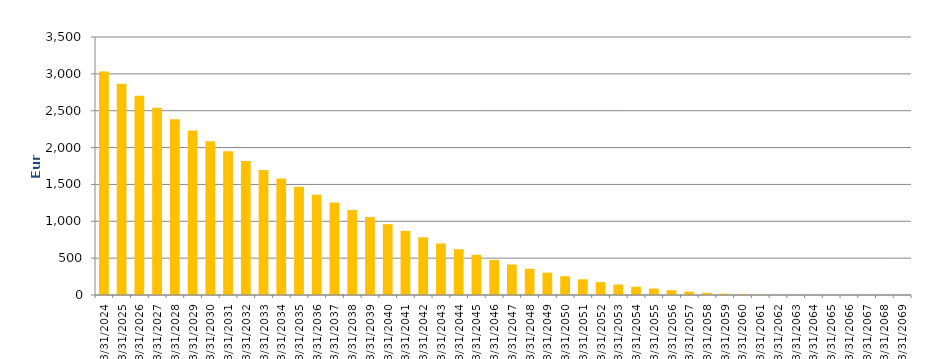
| Category | Series 0 |
|---|---|
| 3/31/24 | 3030.756 |
| 3/31/25 | 2865.177 |
| 3/31/26 | 2701.723 |
| 3/31/27 | 2540.57 |
| 3/31/28 | 2383.332 |
| 3/31/29 | 2231.529 |
| 3/31/30 | 2086.539 |
| 3/31/31 | 1948.987 |
| 3/31/32 | 1818.761 |
| 3/31/33 | 1696.649 |
| 3/31/34 | 1580.824 |
| 3/31/35 | 1469.34 |
| 3/31/36 | 1361.322 |
| 3/31/37 | 1256.496 |
| 3/31/38 | 1154.73 |
| 3/31/39 | 1056.305 |
| 3/31/40 | 961.323 |
| 3/31/41 | 870.153 |
| 3/31/42 | 782.979 |
| 3/31/43 | 699.568 |
| 3/31/44 | 620.242 |
| 3/31/45 | 545.47 |
| 3/31/46 | 476.49 |
| 3/31/47 | 413.53 |
| 3/31/48 | 355.821 |
| 3/31/49 | 303.043 |
| 3/31/50 | 255.127 |
| 3/31/51 | 212.515 |
| 3/31/52 | 174.913 |
| 3/31/53 | 141.882 |
| 3/31/54 | 112.925 |
| 3/31/55 | 87.619 |
| 3/31/56 | 65.317 |
| 3/31/57 | 45.939 |
| 3/31/58 | 30.013 |
| 3/31/59 | 18.261 |
| 3/31/60 | 9.815 |
| 3/31/61 | 4.266 |
| 3/31/62 | 1.664 |
| 3/31/63 | 0.476 |
| 3/31/64 | 0.023 |
| 3/31/65 | 0.017 |
| 3/31/66 | 0.012 |
| 3/31/67 | 0.009 |
| 3/31/68 | 0.005 |
| 3/31/69 | 0.003 |